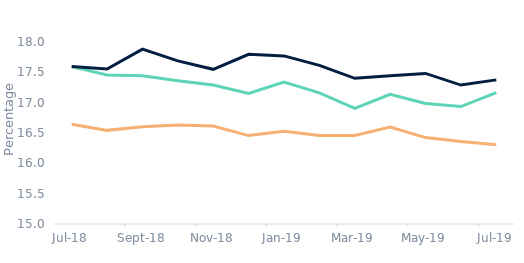
| Category | First-time
buyers | Homemovers | Remortgagors |
|---|---|---|---|
| 2018-07-01 | 17.595 | 17.596 | 16.644 |
| 2018-08-01 | 17.456 | 17.554 | 16.543 |
| 2018-09-01 | 17.444 | 17.883 | 16.604 |
| 2018-10-01 | 17.36 | 17.689 | 16.63 |
| 2018-11-01 | 17.29 | 17.55 | 16.616 |
| 2018-12-01 | 17.152 | 17.798 | 16.457 |
| 2019-01-01 | 17.341 | 17.77 | 16.529 |
| 2019-02-01 | 17.162 | 17.615 | 16.461 |
| 2019-03-01 | 16.904 | 17.402 | 16.46 |
| 2019-04-01 | 17.137 | 17.443 | 16.596 |
| 2019-05-01 | 16.986 | 17.482 | 16.424 |
| 2019-06-01 | 16.935 | 17.29 | 16.358 |
| 2019-07-01 | 17.165 | 17.375 | 16.305 |